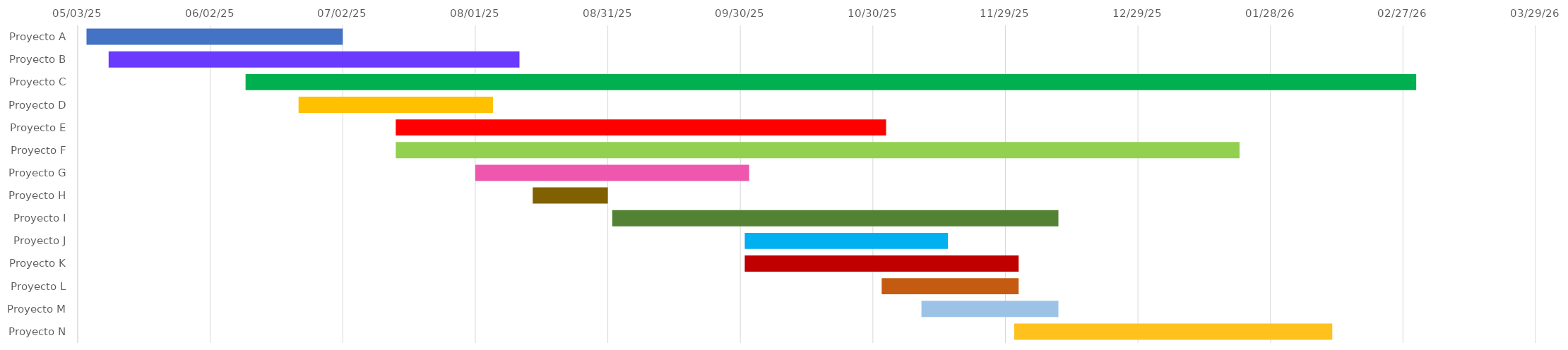
| Category | FECHA DE 
INICIO | Duración |
|---|---|---|
| Proyecto A | 2025-05-05 | 58 |
| Proyecto B | 2025-05-10 | 93 |
| Proyecto C | 2025-06-10 | 265 |
| Proyecto D | 2025-06-22 | 44 |
| Proyecto E | 2025-07-14 | 111 |
| Proyecto F | 2025-07-14 | 191 |
| Proyecto G | 2025-08-01 | 62 |
| Proyecto H | 2025-08-14 | 17 |
| Proyecto I | 2025-09-01 | 101 |
| Proyecto J | 2025-10-01 | 46 |
| Proyecto K | 2025-10-01 | 62 |
| Proyecto L | 2025-11-01 | 31 |
| Proyecto M | 2025-11-10 | 31 |
| Proyecto N | 2025-12-01 | 72 |